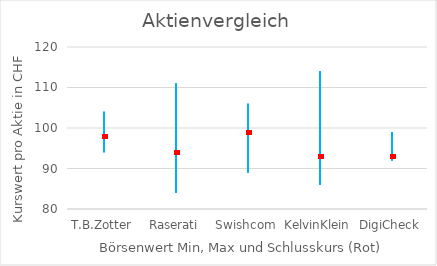
| Category | Series 0 | Series 1 | Series 2 |
|---|---|---|---|
| T.B.Zotter | 94 | 104 | 98 |
| Raserati | 84 | 111 | 94 |
| Swishcom | 89 | 106 | 99 |
| KelvinKlein | 86 | 114 | 93 |
| DigiCheck | 92 | 99 | 93 |